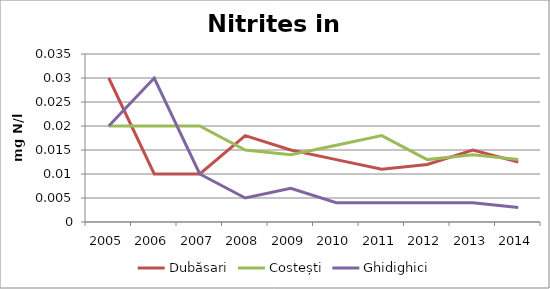
| Category | Dubăsari | Costești | Ghidighici |
|---|---|---|---|
| 2005.0 | 0.03 | 0.02 | 0.02 |
| 2006.0 | 0.01 | 0.02 | 0.03 |
| 2007.0 | 0.01 | 0.02 | 0.01 |
| 2008.0 | 0.018 | 0.015 | 0.005 |
| 2009.0 | 0.015 | 0.014 | 0.007 |
| 2010.0 | 0.013 | 0.016 | 0.004 |
| 2011.0 | 0.011 | 0.018 | 0.004 |
| 2012.0 | 0.012 | 0.013 | 0.004 |
| 2013.0 | 0.015 | 0.014 | 0.004 |
| 2014.0 | 0.012 | 0.013 | 0.003 |